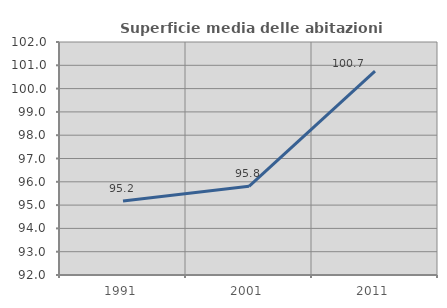
| Category | Superficie media delle abitazioni occupate |
|---|---|
| 1991.0 | 95.18 |
| 2001.0 | 95.806 |
| 2011.0 | 100.749 |